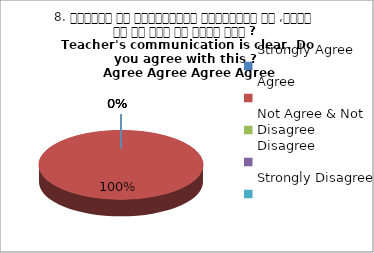
| Category | 8. शिक्षक का सम्प्रेषण सुस्पष्ठ है ,क्या आप इस बात से सहमत हैं ?
Teacher's communication is clear. Do you agree with this ? 
 Agree Agree Agree Agree |
|---|---|
| Strongly Agree | 0 |
| Agree | 4 |
| Not Agree & Not Disagree | 0 |
| Disagree | 0 |
| Strongly Disagree | 0 |